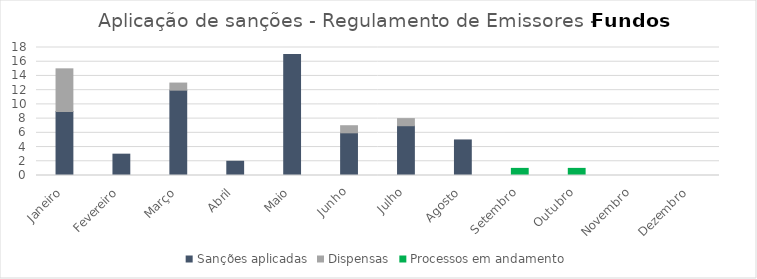
| Category | Sanções aplicadas | Dispensas | Processos em andamento |
|---|---|---|---|
| Janeiro | 9 | 6 | 0 |
| Fevereiro | 3 | 0 | 0 |
| Março | 12 | 1 | 0 |
| Abril | 2 | 0 | 0 |
| Maio | 17 | 0 | 0 |
| Junho | 6 | 1 | 0 |
| Julho | 7 | 1 | 0 |
| Agosto | 5 | 0 | 0 |
| Setembro | 0 | 0 | 1 |
| Outubro | 0 | 0 | 1 |
| Novembro | 0 | 0 | 0 |
| Dezembro | 0 | 0 | 0 |